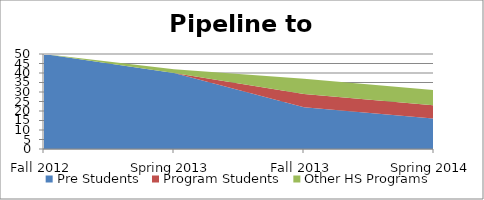
| Category | Pre Students | Program Students | Other HS Programs |
|---|---|---|---|
| Fall 2012 | 50 | 0 | 0 |
| Spring 2013 | 40 | 0 | 2 |
| Fall 2013 | 22 | 7 | 8 |
| Spring 2014 | 16 | 7 | 8 |